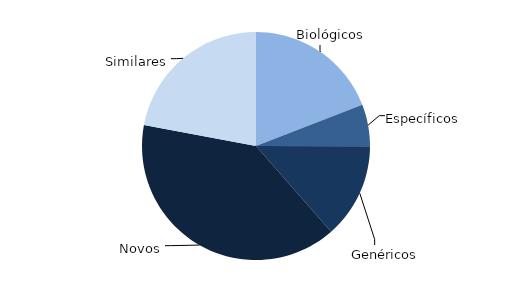
| Category | Series 0 |
|---|---|
| Biológicos | 12141395954.59 |
| Específicos | 3773305517.56 |
| Genéricos | 8581021119.05 |
| Novos | 25030110542.01 |
| Similares | 14021611787.97 |